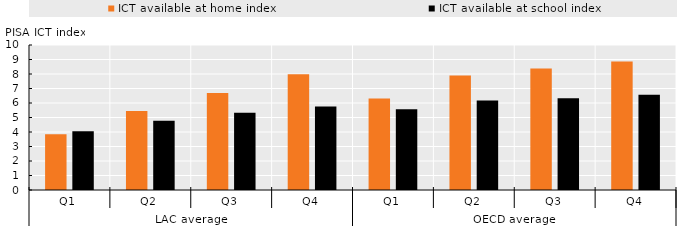
| Category | ICT available at home index | ICT available at school index |
|---|---|---|
| 0 | 3.845 | 4.046 |
| 1 | 5.455 | 4.768 |
| 2 | 6.685 | 5.321 |
| 3 | 7.987 | 5.752 |
| 4 | 6.313 | 5.567 |
| 5 | 7.897 | 6.169 |
| 6 | 8.378 | 6.319 |
| 7 | 8.866 | 6.561 |